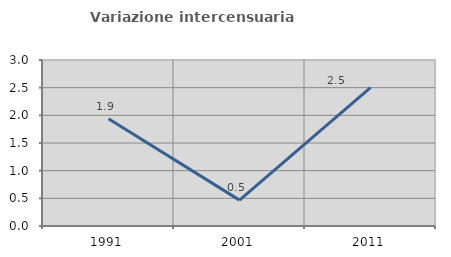
| Category | Variazione intercensuaria annua |
|---|---|
| 1991.0 | 1.938 |
| 2001.0 | 0.467 |
| 2011.0 | 2.499 |